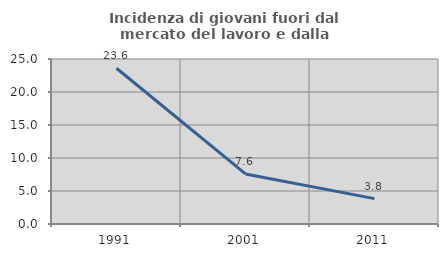
| Category | Incidenza di giovani fuori dal mercato del lavoro e dalla formazione  |
|---|---|
| 1991.0 | 23.602 |
| 2001.0 | 7.583 |
| 2011.0 | 3.846 |